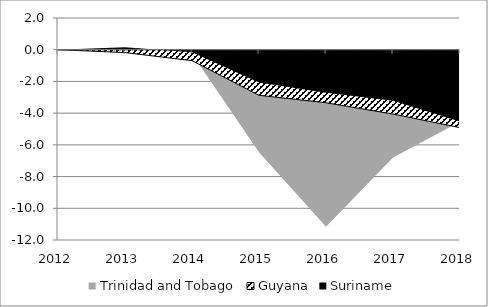
| Category | Trinidad and Tobago | Guyana | Suriname |
|---|---|---|---|
| 2012.0 | 0 | 0 | 0 |
| 2013.0 | -0.082 | -0.181 | 0.148 |
| 2014.0 | -0.264 | -0.69 | -0.153 |
| 2015.0 | -6.466 | -2.875 | -2.075 |
| 2016.0 | -11.16 | -3.344 | -2.72 |
| 2017.0 | -6.798 | -4.058 | -3.215 |
| 2018.0 | -4.539 | -4.917 | -4.533 |